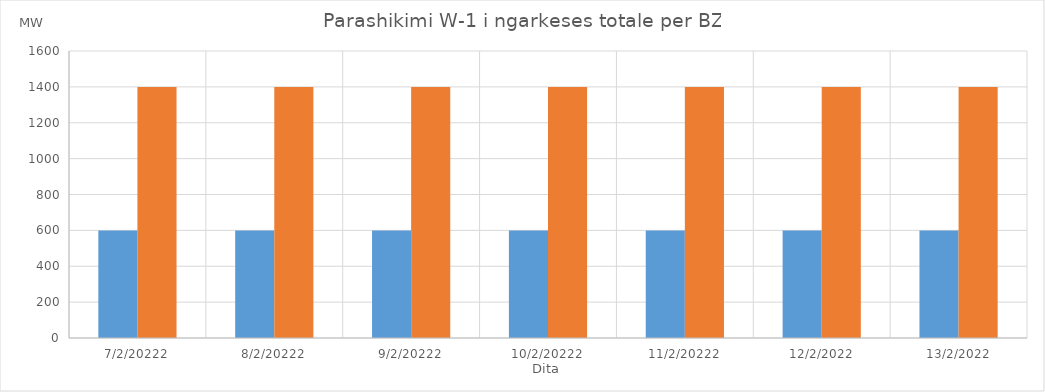
| Category | Min (MW) | Max (MW) |
|---|---|---|
| 7/2/20222 | 600 | 1400 |
| 8/2/20222 | 600 | 1400 |
| 9/2/20222 | 600 | 1400 |
| 10/2/20222 | 600 | 1400 |
| 11/2/20222 | 600 | 1400 |
| 12/2/2022 | 600 | 1400 |
| 13/2/2022 | 600 | 1400 |